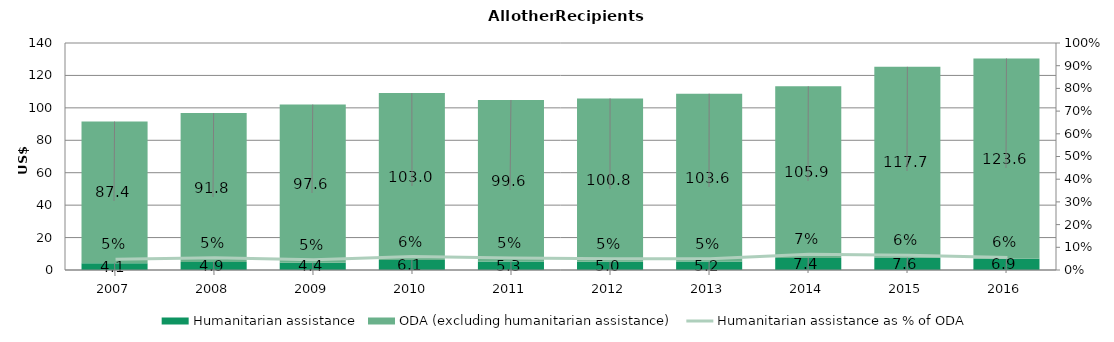
| Category | Humanitarian assistance | ODA (excluding humanitarian assistance) |
|---|---|---|
| 2007.0 | 4.115 | 87.427 |
| 2008.0 | 4.946 | 91.823 |
| 2009.0 | 4.444 | 97.598 |
| 2010.0 | 6.117 | 103.016 |
| 2011.0 | 5.27 | 99.585 |
| 2012.0 | 5.023 | 100.815 |
| 2013.0 | 5.166 | 103.578 |
| 2014.0 | 7.367 | 105.89 |
| 2015.0 | 7.602 | 117.717 |
| 2016.0 | 6.868 | 123.621 |